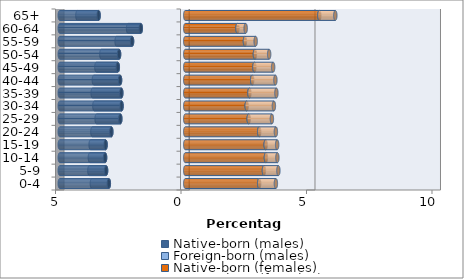
| Category | Native-born (males) | Foreign-born (males) | Native-born (females) | Foreign-born (females) |
|---|---|---|---|---|
| 0-4 | -3.044 | -0.676 | 2.945 | 0.667 |
| 5-9 | -3.154 | -0.667 | 3.134 | 0.577 |
| 10-14 | -3.193 | -0.607 | 3.213 | 0.458 |
| 15-19 | -3.173 | -0.597 | 3.203 | 0.458 |
| 20-24 | -2.945 | -0.756 | 2.945 | 0.667 |
| 25-29 | -2.587 | -0.945 | 2.527 | 0.925 |
| 30-34 | -2.537 | -1.084 | 2.447 | 1.084 |
| 35-39 | -2.547 | -1.144 | 2.557 | 1.074 |
| 40-44 | -2.596 | -1.045 | 2.666 | 0.925 |
| 45-49 | -2.686 | -0.856 | 2.756 | 0.746 |
| 50-54 | -2.636 | -0.706 | 2.776 | 0.567 |
| 55-59 | -2.119 | -0.617 | 2.378 | 0.428 |
| 60-64 | -1.771 | -0.507 | 2.079 | 0.328 |
| 65+ | -3.452 | -0.846 | 5.342 | 0.637 |